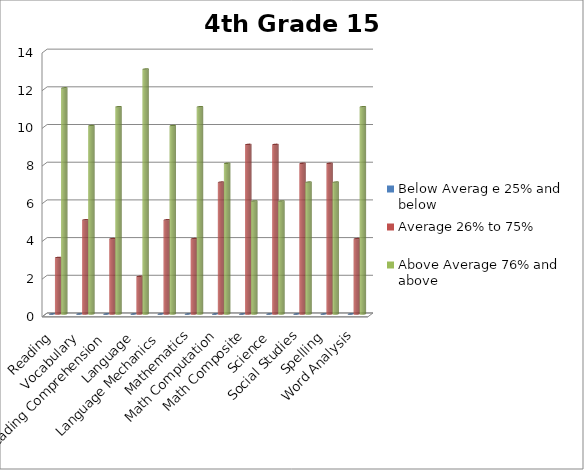
| Category | Below Averag e 25% and below | Average 26% to 75% | Above Average 76% and above |
|---|---|---|---|
| Reading  | 0 | 3 | 12 |
| Vocabulary | 0 | 5 | 10 |
| Reading Comprehension | 0 | 4 | 11 |
| Language | 0 | 2 | 13 |
| Language Mechanics | 0 | 5 | 10 |
| Mathematics | 0 | 4 | 11 |
| Math Computation | 0 | 7 | 8 |
| Math Composite | 0 | 9 | 6 |
| Science | 0 | 9 | 6 |
| Social Studies | 0 | 8 | 7 |
| Spelling | 0 | 8 | 7 |
| Word Analysis | 0 | 4 | 11 |